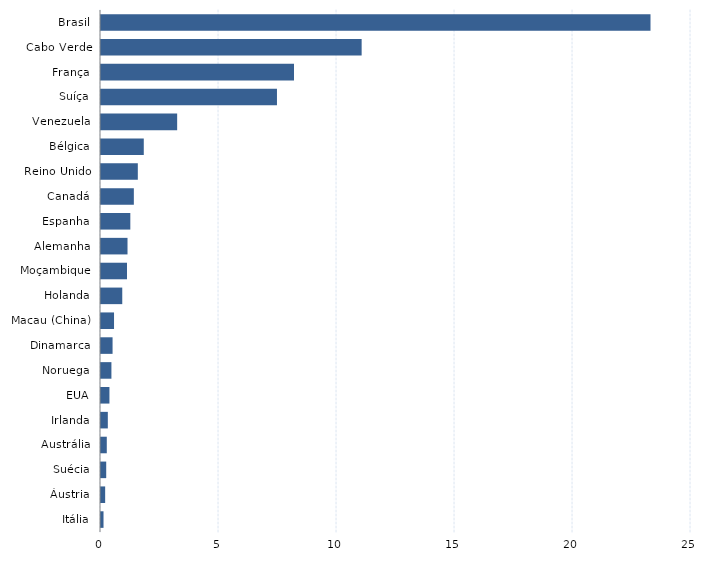
| Category | Series 0 |
|---|---|
| Itália | 0.107 |
| Áustria | 0.176 |
| Suécia | 0.221 |
| Austrália | 0.245 |
| Irlanda | 0.289 |
| EUA | 0.358 |
| Noruega | 0.442 |
| Dinamarca | 0.49 |
| Macau (China) | 0.552 |
| Holanda | 0.901 |
| Moçambique | 1.101 |
| Alemanha | 1.123 |
| Espanha | 1.243 |
| Canadá | 1.392 |
| Reino Unido | 1.56 |
| Bélgica | 1.813 |
| Venezuela | 3.227 |
| Suíça | 7.456 |
| França | 8.178 |
| Cabo Verde | 11.044 |
| Brasil | 23.284 |